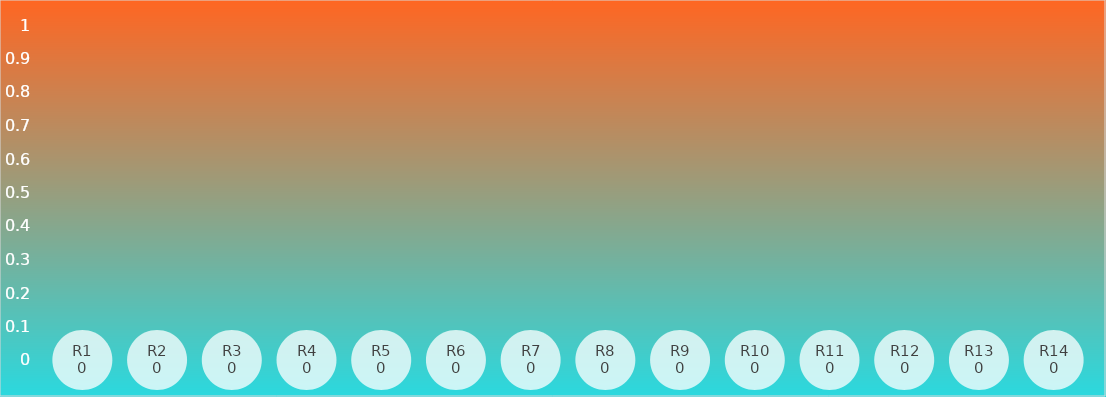
| Category | Series 0 |
|---|---|
| R1 | 0 |
| R2 | 0 |
| R3 | 0 |
| R4 | 0 |
| R5 | 0 |
| R6 | 0 |
| R7 | 0 |
| R8 | 0 |
| R9 | 0 |
| R10 | 0 |
| R11 | 0 |
| R12 | 0 |
| R13 | 0 |
| R14 | 0 |